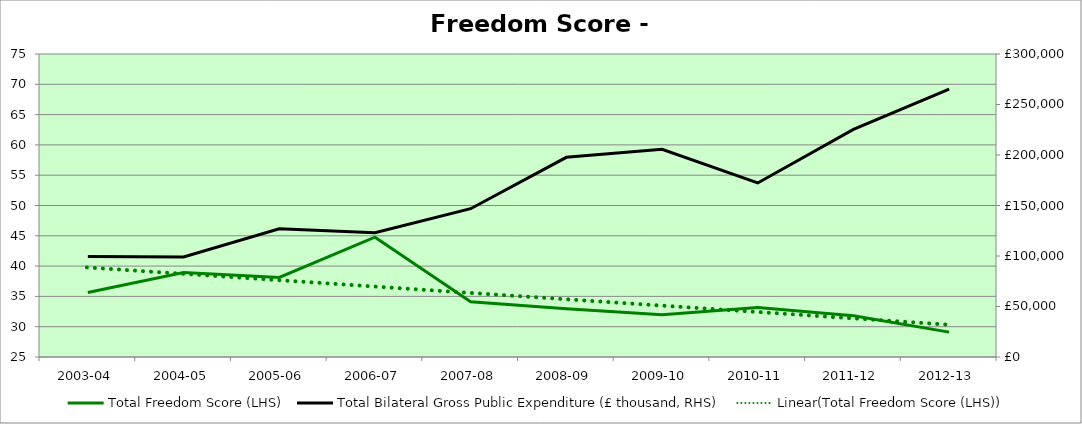
| Category | Total Freedom Score (LHS) |
|---|---|
| 2003-04 | 35.638 |
| 2004-05 | 38.958 |
| 2005-06 | 38.138 |
| 2006-07 | 44.77 |
| 2007-08 | 34.102 |
| 2008-09 | 32.952 |
| 2009-10 | 31.97 |
| 2010-11 | 33.162 |
| 2011-12 | 31.814 |
| 2012-13 | 29.107 |